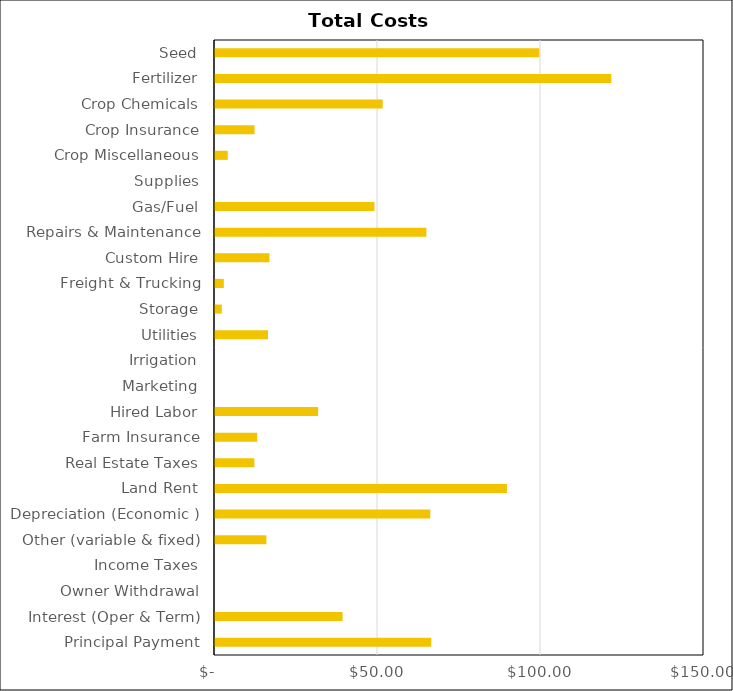
| Category | Corn |
|---|---|
| Seed | 99.48 |
| Fertilizer | 121.572 |
| Crop Chemicals | 51.435 |
| Crop Insurance | 12.13 |
| Crop Miscellaneous | 3.92 |
| Supplies | 0 |
| Gas/Fuel | 48.91 |
| Repairs & Maintenance | 64.84 |
| Custom Hire | 16.7 |
| Freight & Trucking | 2.71 |
| Storage | 2.08 |
| Utilities | 16.26 |
| Irrigation | 0 |
| Marketing | 0 |
| Hired Labor | 31.64 |
| Farm Insurance | 12.95 |
| Real Estate Taxes | 12.08 |
| Land Rent | 89.55 |
| Depreciation (Economic ) | 66.04 |
| Other (variable & fixed) | 15.77 |
| Income Taxes | 0 |
| Owner Withdrawal | 0 |
| Interest (Oper & Term) | 39.133 |
| Principal Payment | 66.328 |